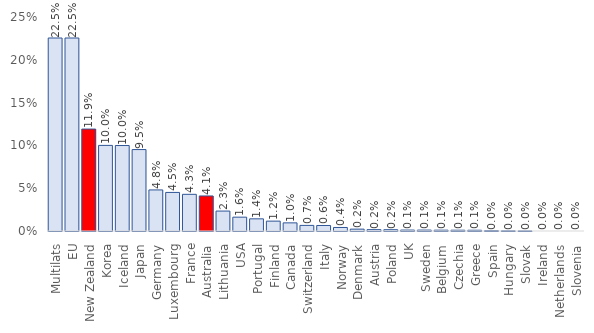
| Category | Total |
|---|---|
| Multilats | 0.225 |
| EU | 0.225 |
| New Zealand | 0.119 |
| Korea | 0.1 |
| Iceland | 0.1 |
| Japan | 0.095 |
| Germany | 0.048 |
| Luxembourg | 0.045 |
| France | 0.043 |
| Australia | 0.041 |
| Lithuania | 0.023 |
| USA | 0.016 |
| Portugal | 0.014 |
| Finland | 0.012 |
| Canada | 0.01 |
| Switzerland | 0.007 |
| Italy | 0.006 |
| Norway | 0.004 |
| Denmark | 0.002 |
| Austria | 0.002 |
| Poland | 0.002 |
| UK | 0.001 |
| Sweden | 0.001 |
| Belgium | 0.001 |
| Czechia | 0.001 |
| Greece | 0.001 |
| Spain | 0 |
| Hungary | 0 |
| Slovak | 0 |
| Ireland | 0 |
| Netherlands | 0 |
| Slovenia | 0 |